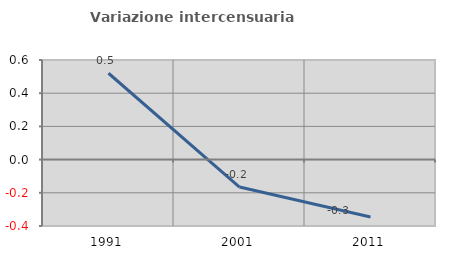
| Category | Variazione intercensuaria annua |
|---|---|
| 1991.0 | 0.52 |
| 2001.0 | -0.165 |
| 2011.0 | -0.346 |